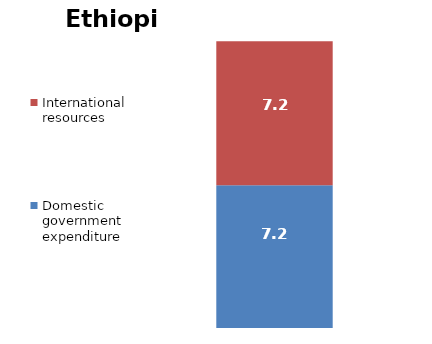
| Category | Domestic government expenditure | International resources |
|---|---|---|
| 0 | 7.181 | 7.248 |